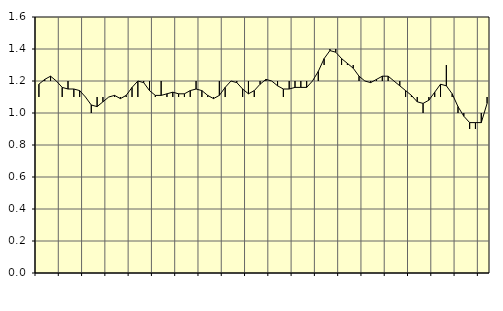
| Category | Piggar | Jordbruk, skogsbruk o fiske, SNI 01-03 |
|---|---|---|
| nan | 1.1 | 1.18 |
| 1.0 | 1.2 | 1.21 |
| 1.0 | 1.2 | 1.23 |
| 1.0 | 1.2 | 1.2 |
| nan | 1.1 | 1.16 |
| 2.0 | 1.2 | 1.15 |
| 2.0 | 1.1 | 1.15 |
| 2.0 | 1.1 | 1.14 |
| nan | 1.1 | 1.1 |
| 3.0 | 1 | 1.05 |
| 3.0 | 1.1 | 1.04 |
| 3.0 | 1.1 | 1.07 |
| nan | 1.1 | 1.1 |
| 4.0 | 1.1 | 1.11 |
| 4.0 | 1.1 | 1.09 |
| 4.0 | 1.1 | 1.11 |
| nan | 1.1 | 1.16 |
| 5.0 | 1.1 | 1.2 |
| 5.0 | 1.2 | 1.19 |
| 5.0 | 1.2 | 1.14 |
| nan | 1.1 | 1.11 |
| 6.0 | 1.2 | 1.11 |
| 6.0 | 1.1 | 1.12 |
| 6.0 | 1.1 | 1.13 |
| nan | 1.1 | 1.12 |
| 7.0 | 1.1 | 1.12 |
| 7.0 | 1.1 | 1.14 |
| 7.0 | 1.2 | 1.15 |
| nan | 1.1 | 1.14 |
| 8.0 | 1.1 | 1.11 |
| 8.0 | 1.1 | 1.09 |
| 8.0 | 1.2 | 1.11 |
| nan | 1.1 | 1.16 |
| 9.0 | 1.2 | 1.2 |
| 9.0 | 1.2 | 1.19 |
| 9.0 | 1.1 | 1.15 |
| nan | 1.2 | 1.12 |
| 10.0 | 1.1 | 1.14 |
| 10.0 | 1.2 | 1.18 |
| 10.0 | 1.2 | 1.21 |
| nan | 1.2 | 1.2 |
| 11.0 | 1.2 | 1.17 |
| 11.0 | 1.1 | 1.15 |
| 11.0 | 1.2 | 1.15 |
| nan | 1.2 | 1.16 |
| 12.0 | 1.2 | 1.16 |
| 12.0 | 1.2 | 1.16 |
| 12.0 | 1.2 | 1.2 |
| nan | 1.2 | 1.26 |
| 13.0 | 1.3 | 1.34 |
| 13.0 | 1.4 | 1.39 |
| 13.0 | 1.4 | 1.38 |
| nan | 1.3 | 1.34 |
| 14.0 | 1.3 | 1.31 |
| 14.0 | 1.3 | 1.28 |
| 14.0 | 1.2 | 1.23 |
| nan | 1.2 | 1.2 |
| 15.0 | 1.2 | 1.19 |
| 15.0 | 1.2 | 1.21 |
| 15.0 | 1.2 | 1.23 |
| nan | 1.2 | 1.23 |
| 16.0 | 1.2 | 1.2 |
| 16.0 | 1.2 | 1.17 |
| 16.0 | 1.1 | 1.14 |
| nan | 1.1 | 1.11 |
| 17.0 | 1.1 | 1.07 |
| 17.0 | 1 | 1.06 |
| 17.0 | 1.1 | 1.08 |
| nan | 1.1 | 1.13 |
| 18.0 | 1.1 | 1.18 |
| 18.0 | 1.3 | 1.17 |
| 18.0 | 1.1 | 1.12 |
| nan | 1 | 1.04 |
| 19.0 | 1 | 0.98 |
| 19.0 | 0.9 | 0.94 |
| 19.0 | 0.9 | 0.94 |
| nan | 1 | 0.94 |
| 20.0 | 1.1 | 1.06 |